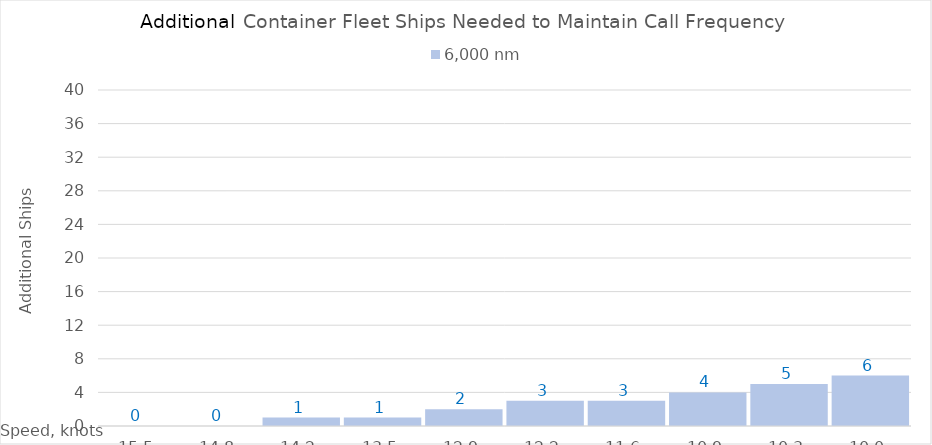
| Category | 6,000 |
|---|---|
| 15.450000000000001 | 0 |
| 14.8 | 0 |
| 14.15 | 1 |
| 13.5 | 1 |
| 12.85 | 2 |
| 12.2 | 3 |
| 11.549999999999999 | 3 |
| 10.899999999999999 | 4 |
| 10.249999999999998 | 5 |
| 10.0 | 6 |